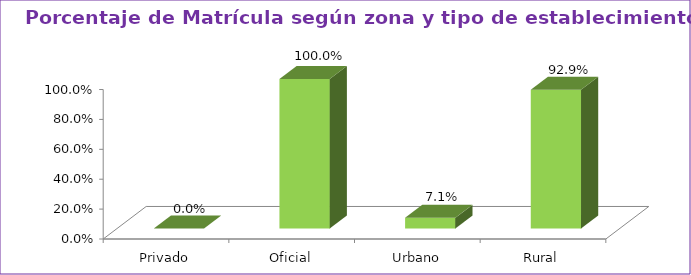
| Category | Series 1 |
|---|---|
| Privado | 0 |
| Oficial | 1 |
| Urbano | 0.071 |
| Rural | 0.929 |